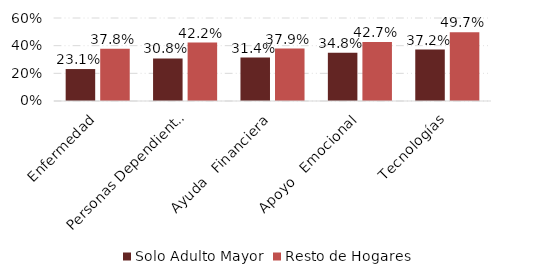
| Category | Solo Adulto Mayor | Resto de Hogares |
|---|---|---|
| Enfermedad | 0.231 | 0.378 |
| Personas Dependientes | 0.308 | 0.422 |
| Ayuda   Financiera | 0.314 | 0.379 |
| Apoyo   Emocional | 0.348 | 0.427 |
| Tecnologías | 0.372 | 0.497 |